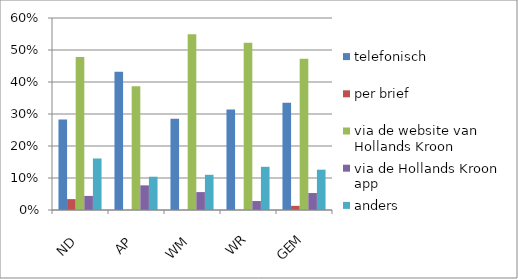
| Category | telefonisch | per brief | via de website van Hollands Kroon | via de Hollands Kroon app | anders |
|---|---|---|---|---|---|
| ND | 0.283 | 0.034 | 0.478 | 0.044 | 0.161 |
| AP | 0.432 | 0 | 0.387 | 0.077 | 0.104 |
| WM | 0.285 | 0 | 0.549 | 0.056 | 0.11 |
| WR | 0.314 | 0 | 0.523 | 0.028 | 0.135 |
| GEM | 0.335 | 0.013 | 0.473 | 0.053 | 0.126 |